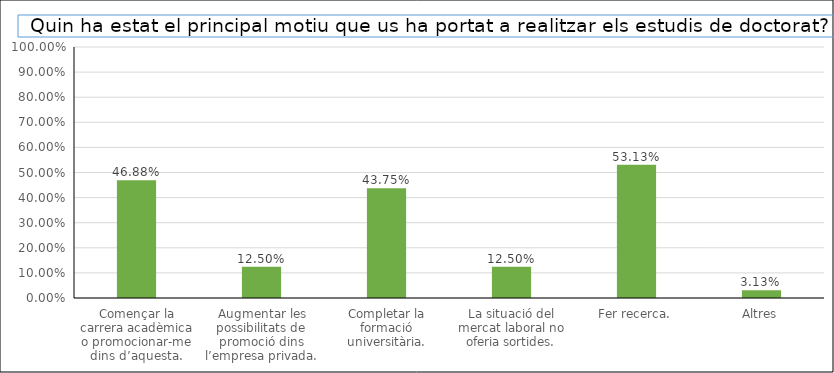
| Category | Series 0 |
|---|---|
| Començar la carrera acadèmica o promocionar-me dins d’aquesta. | 0.469 |
| Augmentar les possibilitats de promoció dins l’empresa privada. | 0.125 |
| Completar la formació universitària. | 0.438 |
| La situació del mercat laboral no oferia sortides. | 0.125 |
| Fer recerca. | 0.531 |
| Altres | 0.031 |